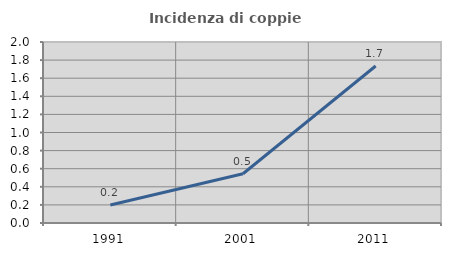
| Category | Incidenza di coppie miste |
|---|---|
| 1991.0 | 0.199 |
| 2001.0 | 0.545 |
| 2011.0 | 1.735 |